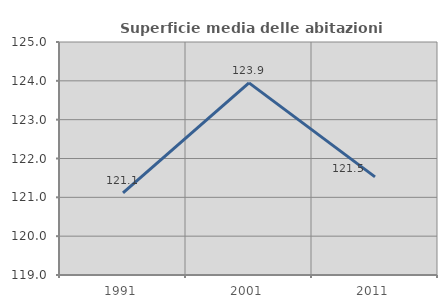
| Category | Superficie media delle abitazioni occupate |
|---|---|
| 1991.0 | 121.117 |
| 2001.0 | 123.948 |
| 2011.0 | 121.528 |